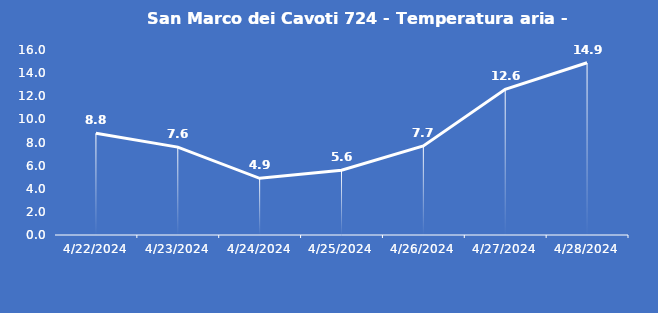
| Category | San Marco dei Cavoti 724 - Temperatura aria - Grezzo (°C) |
|---|---|
| 4/22/24 | 8.8 |
| 4/23/24 | 7.6 |
| 4/24/24 | 4.9 |
| 4/25/24 | 5.6 |
| 4/26/24 | 7.7 |
| 4/27/24 | 12.6 |
| 4/28/24 | 14.9 |